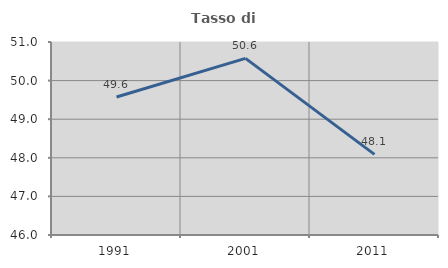
| Category | Tasso di occupazione   |
|---|---|
| 1991.0 | 49.576 |
| 2001.0 | 50.576 |
| 2011.0 | 48.088 |